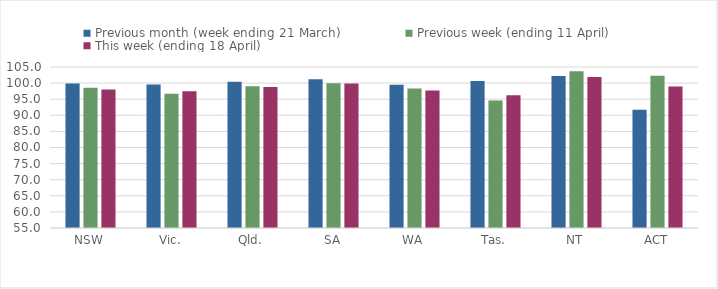
| Category | Previous month (week ending 21 March) | Previous week (ending 11 April) | This week (ending 18 April) |
|---|---|---|---|
| NSW | 99.91 | 98.566 | 98.025 |
| Vic. | 99.547 | 96.678 | 97.485 |
| Qld. | 100.407 | 98.988 | 98.793 |
| SA | 101.173 | 99.94 | 99.84 |
| WA | 99.525 | 98.327 | 97.713 |
| Tas. | 100.68 | 94.612 | 96.191 |
| NT | 102.177 | 103.658 | 101.899 |
| ACT | 91.702 | 102.309 | 98.969 |